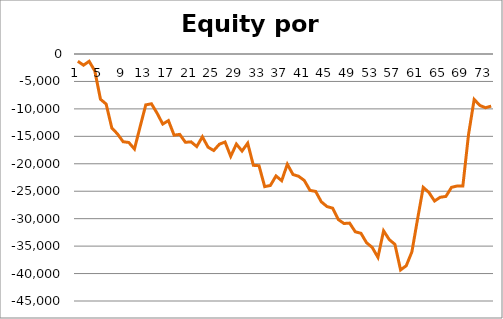
| Category | Series 0 |
|---|---|
| 0 | -1325 |
| 1 | -2037.5 |
| 2 | -1331.25 |
| 3 | -3081.25 |
| 4 | -8241.25 |
| 5 | -9121.25 |
| 6 | -13471.25 |
| 7 | -14561.25 |
| 8 | -15981.25 |
| 9 | -16118.75 |
| 10 | -17308.75 |
| 11 | -13248.75 |
| 12 | -9268.75 |
| 13 | -9063.75 |
| 14 | -10788.75 |
| 15 | -12763.75 |
| 16 | -12133.75 |
| 17 | -14783.75 |
| 18 | -14646.25 |
| 19 | -16086.25 |
| 20 | -16005 |
| 21 | -16860 |
| 22 | -15085 |
| 23 | -16975 |
| 24 | -17585 |
| 25 | -16435 |
| 26 | -16035 |
| 27 | -18647.5 |
| 28 | -16407.5 |
| 29 | -17677.5 |
| 30 | -16252.5 |
| 31 | -20282.5 |
| 32 | -20352.5 |
| 33 | -24165 |
| 34 | -23952.5 |
| 35 | -22221.25 |
| 36 | -23083.75 |
| 37 | -20083.75 |
| 38 | -21958.75 |
| 39 | -22277.45 |
| 40 | -23047.45 |
| 41 | -24842.45 |
| 42 | -25036.25 |
| 43 | -26926.25 |
| 44 | -27788.75 |
| 45 | -28088.75 |
| 46 | -30158.75 |
| 47 | -30878.75 |
| 48 | -30810 |
| 49 | -32390 |
| 50 | -32665 |
| 51 | -34390 |
| 52 | -35250 |
| 53 | -37050 |
| 54 | -32220 |
| 55 | -33810 |
| 56 | -34680 |
| 57 | -39340 |
| 58 | -38577.5 |
| 59 | -36040 |
| 60 | -30070 |
| 61 | -24295 |
| 62 | -25220 |
| 63 | -26788.8 |
| 64 | -26098.8 |
| 65 | -25948.8 |
| 66 | -24293.8 |
| 67 | -24043.8 |
| 68 | -24043.8 |
| 69 | -14681.3 |
| 70 | -8271.3 |
| 71 | -9371.3 |
| 72 | -9791.3 |
| 73 | -9491.3 |